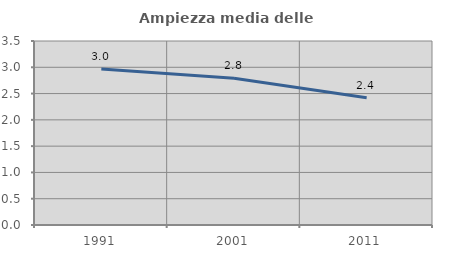
| Category | Ampiezza media delle famiglie |
|---|---|
| 1991.0 | 2.966 |
| 2001.0 | 2.793 |
| 2011.0 | 2.42 |